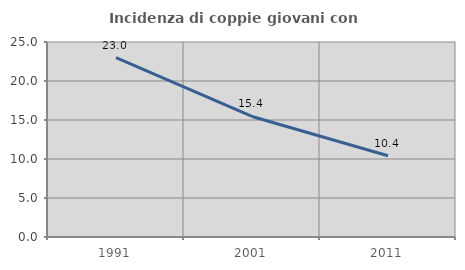
| Category | Incidenza di coppie giovani con figli |
|---|---|
| 1991.0 | 23.005 |
| 2001.0 | 15.45 |
| 2011.0 | 10.422 |